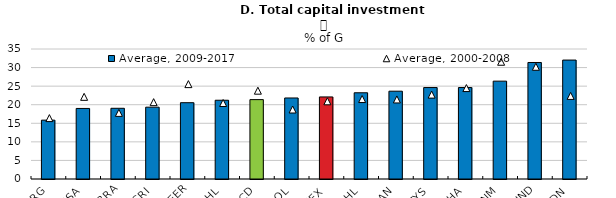
| Category | Average, 2009-2017 |
|---|---|
| ARG | 15.845 |
| USA | 18.998 |
| BRA | 19.038 |
| CRI | 19.334 |
| PEER | 20.546 |
| PHL | 21.203 |
| OECD | 21.372 |
| COL | 21.814 |
| MEX | 22.097 |
| CHL | 23.213 |
| CAN | 23.639 |
| MYS | 24.618 |
| THA | 24.626 |
| VNM | 26.345 |
| IND | 31.369 |
| IDN | 32.018 |